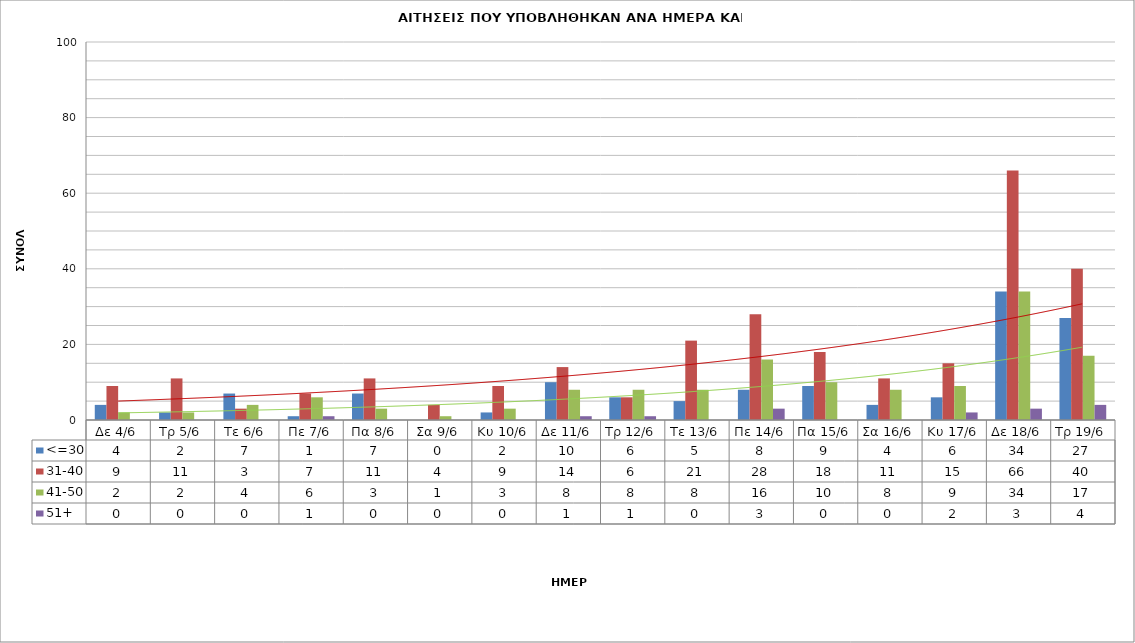
| Category | <=30 | 31-40 | 41-50 | 51+ |
|---|---|---|---|---|
| Δε 4/6 | 4 | 9 | 2 | 0 |
| Τρ 5/6 | 2 | 11 | 2 | 0 |
| Τε 6/6 | 7 | 3 | 4 | 0 |
| Πε 7/6 | 1 | 7 | 6 | 1 |
| Πα 8/6 | 7 | 11 | 3 | 0 |
| Σα 9/6 | 0 | 4 | 1 | 0 |
| Κυ 10/6 | 2 | 9 | 3 | 0 |
| Δε 11/6 | 10 | 14 | 8 | 1 |
| Τρ 12/6 | 6 | 6 | 8 | 1 |
| Τε 13/6 | 5 | 21 | 8 | 0 |
| Πε 14/6 | 8 | 28 | 16 | 3 |
| Πα 15/6 | 9 | 18 | 10 | 0 |
| Σα 16/6 | 4 | 11 | 8 | 0 |
| Κυ 17/6 | 6 | 15 | 9 | 2 |
| Δε 18/6 | 34 | 66 | 34 | 3 |
| Τρ 19/6 | 27 | 40 | 17 | 4 |